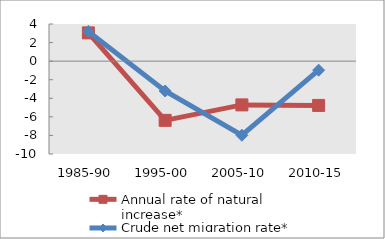
| Category | Annual rate of natural increase* | Crude net migration rate* |
|---|---|---|
| 1985-90 | 3.043 | 3.203 |
| 1995-00 | -6.377 | -3.214 |
| 2005-10 | -4.712 | -7.982 |
| 2010-15 | -4.77 | -0.97 |